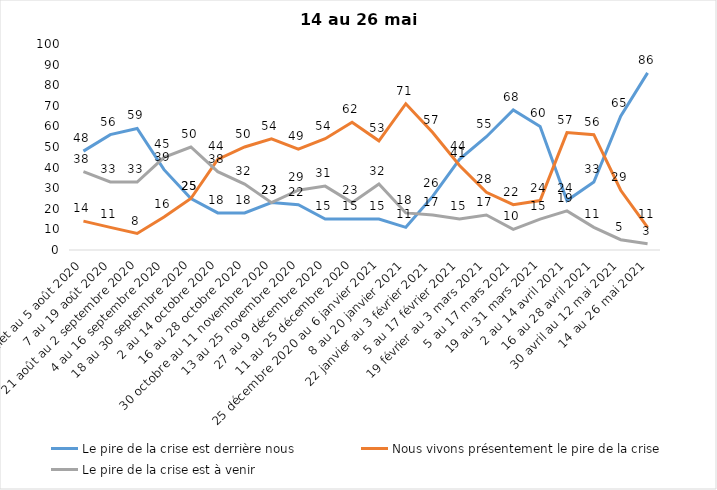
| Category | Le pire de la crise est derrière nous | Nous vivons présentement le pire de la crise | Le pire de la crise est à venir |
|---|---|---|---|
| 24 juillet au 5 août 2020 | 48 | 14 | 38 |
| 7 au 19 août 2020 | 56 | 11 | 33 |
| 21 août au 2 septembre 2020 | 59 | 8 | 33 |
| 4 au 16 septembre 2020 | 39 | 16 | 45 |
| 18 au 30 septembre 2020 | 25 | 25 | 50 |
| 2 au 14 octobre 2020 | 18 | 44 | 38 |
| 16 au 28 octobre 2020 | 18 | 50 | 32 |
| 30 octobre au 11 novembre 2020 | 23 | 54 | 23 |
| 13 au 25 novembre 2020 | 22 | 49 | 29 |
| 27 au 9 décembre 2020 | 15 | 54 | 31 |
| 11 au 25 décembre 2020 | 15 | 62 | 23 |
| 25 décembre 2020 au 6 janvier 2021 | 15 | 53 | 32 |
| 8 au 20 janvier 2021 | 11 | 71 | 18 |
| 22 janvier au 3 février 2021 | 26 | 57 | 17 |
| 5 au 17 février 2021 | 44 | 41 | 15 |
| 19 février au 3 mars 2021 | 55 | 28 | 17 |
| 5 au 17 mars 2021 | 68 | 22 | 10 |
| 19 au 31 mars 2021 | 60 | 24 | 15 |
| 2 au 14 avril 2021 | 24 | 57 | 19 |
| 16 au 28 avril 2021 | 33 | 56 | 11 |
| 30 avril au 12 mai 2021 | 65 | 29 | 5 |
| 14 au 26 mai 2021 | 86 | 11 | 3 |